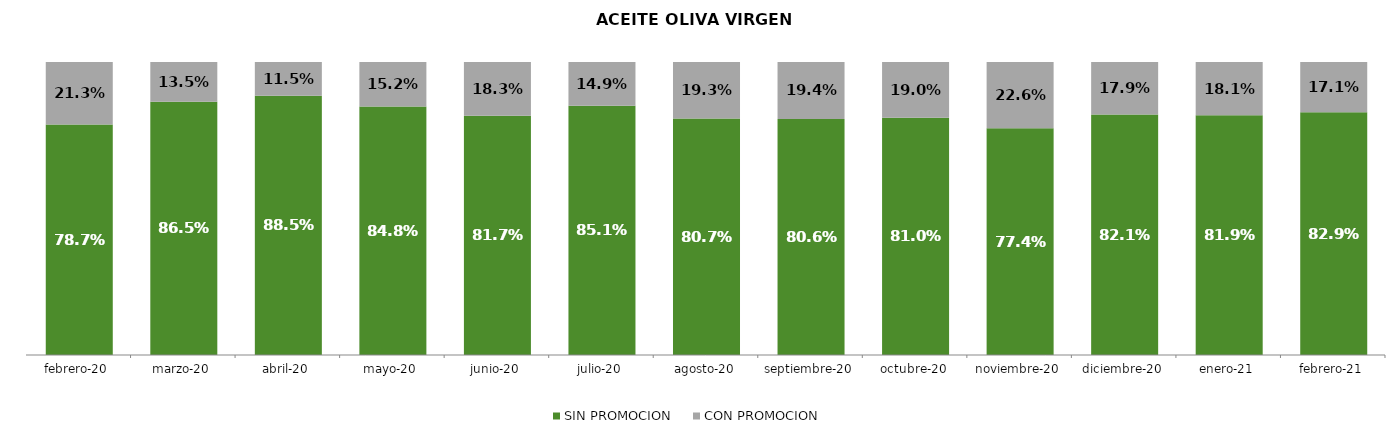
| Category | SIN PROMOCION   | CON PROMOCION   |
|---|---|---|
| 2020-02-01 | 0.787 | 0.213 |
| 2020-03-01 | 0.865 | 0.135 |
| 2020-04-01 | 0.885 | 0.115 |
| 2020-05-01 | 0.848 | 0.152 |
| 2020-06-01 | 0.817 | 0.183 |
| 2020-07-01 | 0.851 | 0.149 |
| 2020-08-01 | 0.807 | 0.193 |
| 2020-09-01 | 0.806 | 0.194 |
| 2020-10-01 | 0.81 | 0.19 |
| 2020-11-01 | 0.774 | 0.226 |
| 2020-12-01 | 0.821 | 0.179 |
| 2021-01-01 | 0.819 | 0.181 |
| 2021-02-01 | 0.829 | 0.171 |